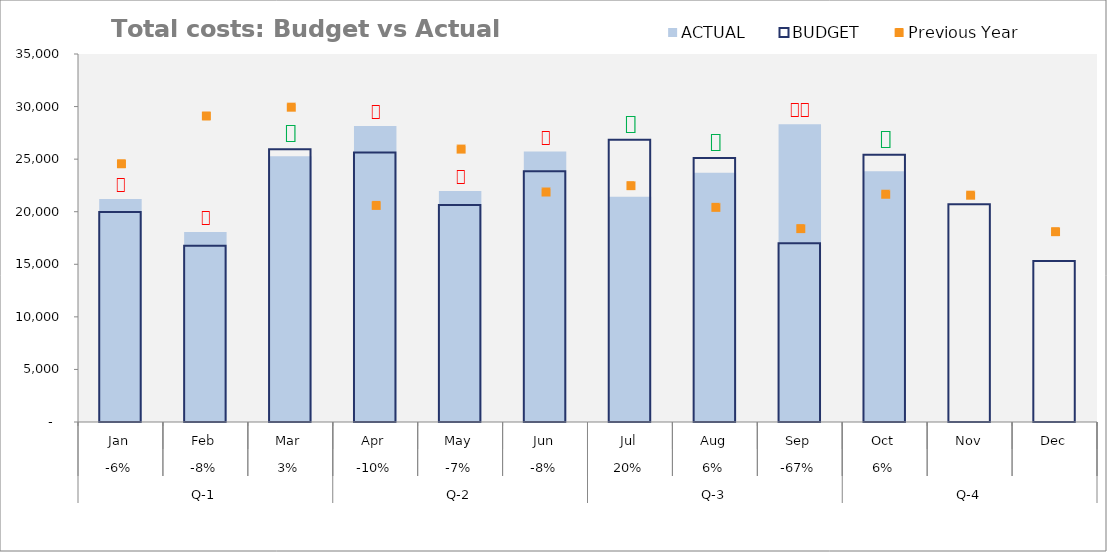
| Category | ACTUAL | BUDGET |
|---|---|---|
| 0 | 21200 | 19978 |
| 1 | 18070 | 16762 |
| 2 | 25268 | 25940 |
| 3 | 28148 | 25641 |
| 4 | 21977 | 20635 |
| 5 | 25720 | 23841 |
| 6 | 21421 | 26850 |
| 7 | 23717 | 25111 |
| 8 | 28321 | 16999 |
| 9 | 23852 | 25407 |
| 10 | 0 | 20712 |
| 11 | 0 | 15324 |